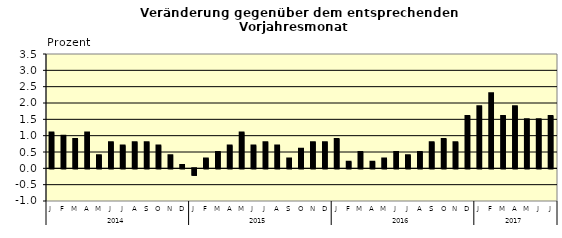
| Category | Series 0 |
|---|---|
| 0 | 1.1 |
| 1 | 1 |
| 2 | 0.9 |
| 3 | 1.1 |
| 4 | 0.4 |
| 5 | 0.8 |
| 6 | 0.7 |
| 7 | 0.8 |
| 8 | 0.8 |
| 9 | 0.7 |
| 10 | 0.4 |
| 11 | 0.1 |
| 12 | -0.2 |
| 13 | 0.3 |
| 14 | 0.5 |
| 15 | 0.7 |
| 16 | 1.1 |
| 17 | 0.7 |
| 18 | 0.8 |
| 19 | 0.7 |
| 20 | 0.3 |
| 21 | 0.6 |
| 22 | 0.8 |
| 23 | 0.8 |
| 24 | 0.9 |
| 25 | 0.2 |
| 26 | 0.5 |
| 27 | 0.2 |
| 28 | 0.3 |
| 29 | 0.5 |
| 30 | 0.4 |
| 31 | 0.5 |
| 32 | 0.8 |
| 33 | 0.9 |
| 34 | 0.8 |
| 35 | 1.6 |
| 36 | 1.9 |
| 37 | 2.3 |
| 38 | 1.6 |
| 39 | 1.9 |
| 40 | 1.5 |
| 41 | 1.5 |
| 42 | 1.6 |